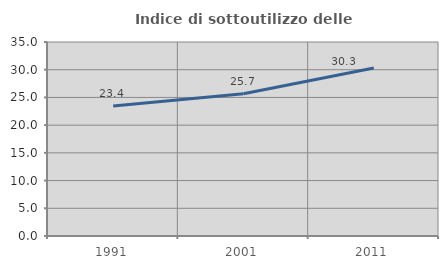
| Category | Indice di sottoutilizzo delle abitazioni  |
|---|---|
| 1991.0 | 23.449 |
| 2001.0 | 25.68 |
| 2011.0 | 30.304 |